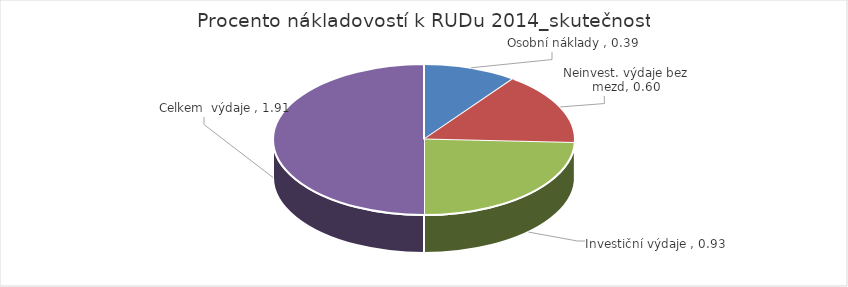
| Category | Series 0 |
|---|---|
| Osobní náklady  | 0.387 |
| Neinvest. výdaje bez mezd | 0.598 |
| Investiční výdaje  | 0.93 |
| Celkem  výdaje  | 1.915 |